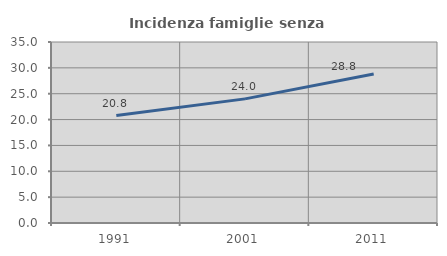
| Category | Incidenza famiglie senza nuclei |
|---|---|
| 1991.0 | 20.769 |
| 2001.0 | 24.003 |
| 2011.0 | 28.817 |